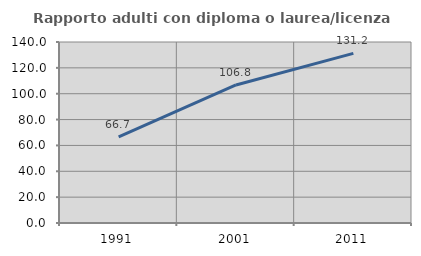
| Category | Rapporto adulti con diploma o laurea/licenza media  |
|---|---|
| 1991.0 | 66.667 |
| 2001.0 | 106.79 |
| 2011.0 | 131.19 |